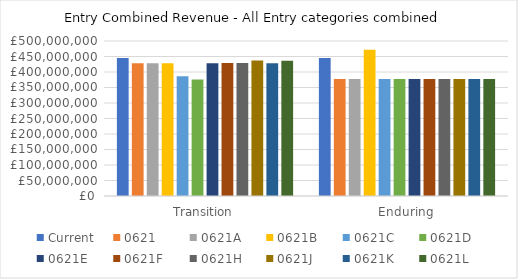
| Category | Current | 0621 | 0621A | 0621B | 0621C | 0621D | 0621E | 0621F | 0621H | 0621J | 0621K | 0621L |
|---|---|---|---|---|---|---|---|---|---|---|---|---|
| Transition | 445215636.201 | 428246277.458 | 428246277.458 | 428246277.458 | 385894011.373 | 375865792.513 | 428246277.458 | 429234116.475 | 429108406.345 | 436870108.678 | 428246277.458 | 436643084.81 |
| Enduring | 445215636.201 | 377492200.102 | 377492200.102 | 471886620.748 | 377492200.102 | 377492200.102 | 377492200.102 | 377492200.102 | 377492200.102 | 377492200.102 | 377492200.102 | 377492200.102 |